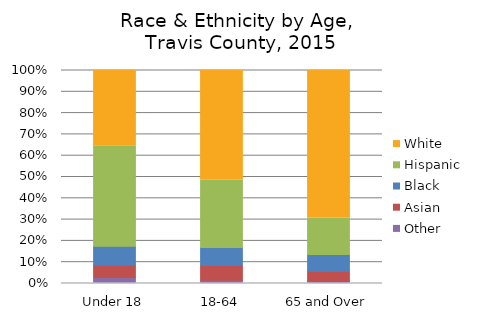
| Category | Other | Asian | Black | Hispanic | White |
|---|---|---|---|---|---|
| Under 18 | 0.028 | 0.058 | 0.09 | 0.471 | 0.353 |
| 18-64 | 0.016 | 0.069 | 0.085 | 0.316 | 0.515 |
| 65 and Over | 0.009 | 0.047 | 0.079 | 0.171 | 0.693 |